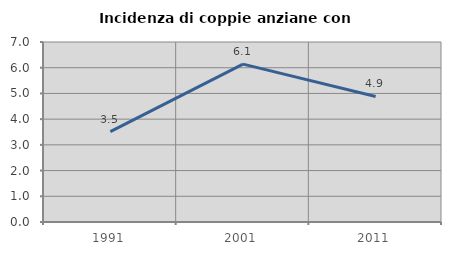
| Category | Incidenza di coppie anziane con figli |
|---|---|
| 1991.0 | 3.511 |
| 2001.0 | 6.138 |
| 2011.0 | 4.882 |